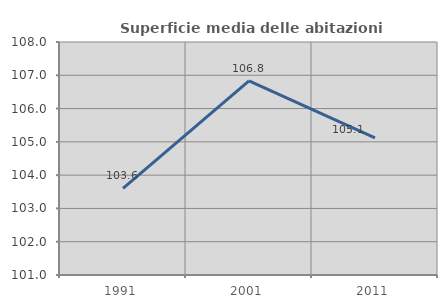
| Category | Superficie media delle abitazioni occupate |
|---|---|
| 1991.0 | 103.6 |
| 2001.0 | 106.835 |
| 2011.0 | 105.117 |